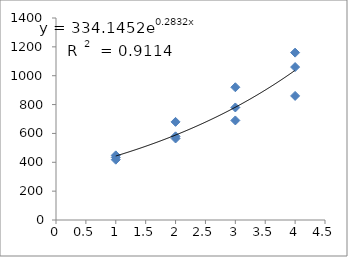
| Category | Series 0 |
|---|---|
| 1.0 | 434 |
| 1.0 | 448 |
| 1.0 | 418 |
| 2.0 | 565 |
| 2.0 | 580 |
| 2.0 | 680 |
| 3.0 | 780 |
| 3.0 | 920 |
| 3.0 | 690 |
| 4.0 | 1160 |
| 4.0 | 1060 |
| 4.0 | 860 |